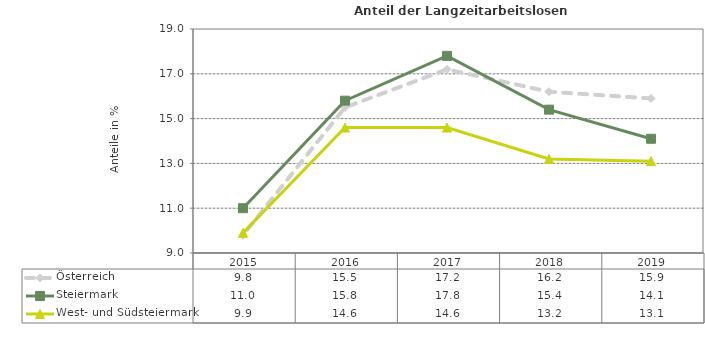
| Category | Österreich | Steiermark | West- und Südsteiermark |
|---|---|---|---|
| 2019.0 | 15.9 | 14.1 | 13.1 |
| 2018.0 | 16.2 | 15.4 | 13.2 |
| 2017.0 | 17.2 | 17.8 | 14.6 |
| 2016.0 | 15.5 | 15.8 | 14.6 |
| 2015.0 | 9.8 | 11 | 9.9 |